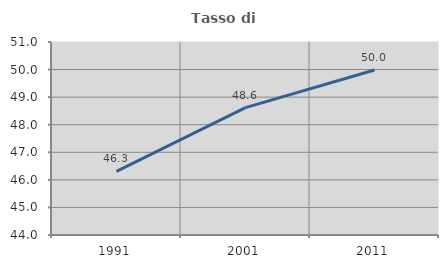
| Category | Tasso di occupazione   |
|---|---|
| 1991.0 | 46.305 |
| 2001.0 | 48.618 |
| 2011.0 | 49.985 |